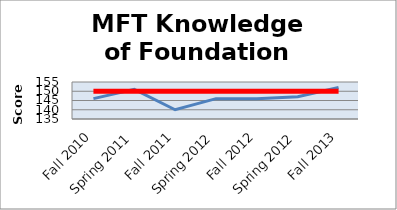
| Category | Score | Benchmark |
|---|---|---|
| Fall 2010 | 146 | 150 |
| Spring 2011 | 151 | 150 |
| Fall 2011 | 140 | 150 |
| Spring 2012 | 146 | 150 |
| Fall 2012 | 146 | 150 |
| Spring 2012 | 147 | 150 |
| Fall 2013 | 152 | 150 |